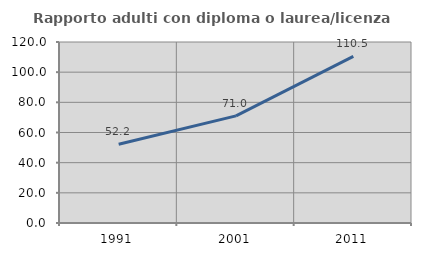
| Category | Rapporto adulti con diploma o laurea/licenza media  |
|---|---|
| 1991.0 | 52.199 |
| 2001.0 | 71.021 |
| 2011.0 | 110.462 |